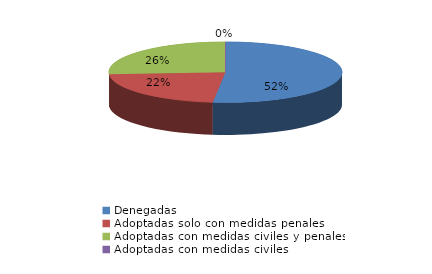
| Category | Series 0 |
|---|---|
| Denegadas | 403 |
| Adoptadas solo con medidas penales | 173 |
| Adoptadas con medidas civiles y penales | 203 |
| Adoptadas con medidas civiles | 0 |